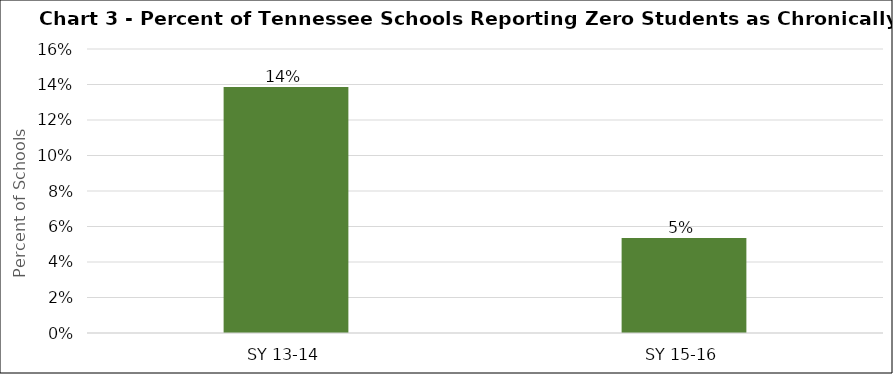
| Category | Series 0 |
|---|---|
| SY 13-14 | 0.139 |
| SY 15-16 | 0.054 |